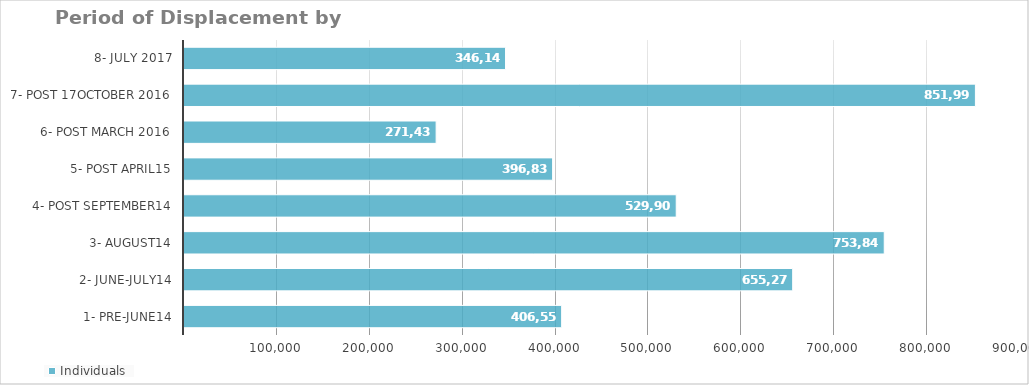
| Category | Individuals |
|---|---|
| 1- Pre-June14 | 406554 |
| 2- June-July14 | 655272 |
| 3- August14 | 753846 |
| 4- Post September14 | 529908 |
| 5- Post April15 | 396834 |
| 6- Post March 2016 | 271434 |
| 7- Post 17October 2016 | 851994 |
| 8- July 2017 | 346140 |